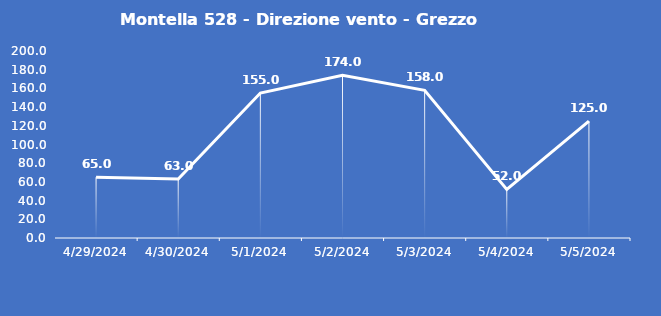
| Category | Montella 528 - Direzione vento - Grezzo (°N) |
|---|---|
| 4/29/24 | 65 |
| 4/30/24 | 63 |
| 5/1/24 | 155 |
| 5/2/24 | 174 |
| 5/3/24 | 158 |
| 5/4/24 | 52 |
| 5/5/24 | 125 |